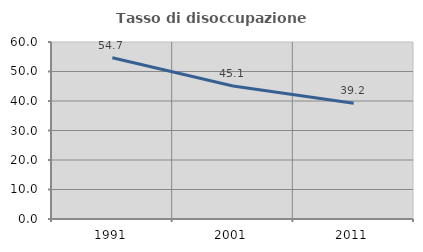
| Category | Tasso di disoccupazione giovanile  |
|---|---|
| 1991.0 | 54.65 |
| 2001.0 | 45.058 |
| 2011.0 | 39.205 |